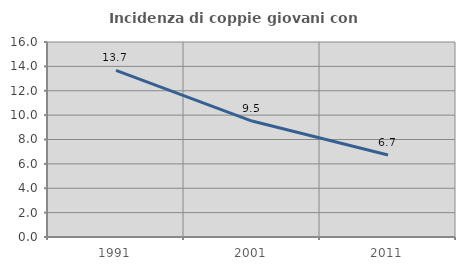
| Category | Incidenza di coppie giovani con figli |
|---|---|
| 1991.0 | 13.668 |
| 2001.0 | 9.513 |
| 2011.0 | 6.723 |